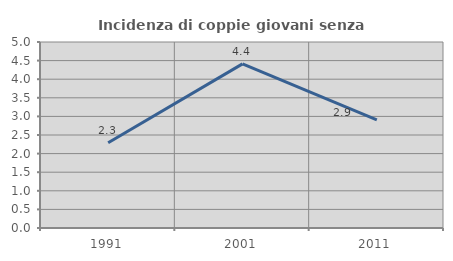
| Category | Incidenza di coppie giovani senza figli |
|---|---|
| 1991.0 | 2.294 |
| 2001.0 | 4.412 |
| 2011.0 | 2.907 |